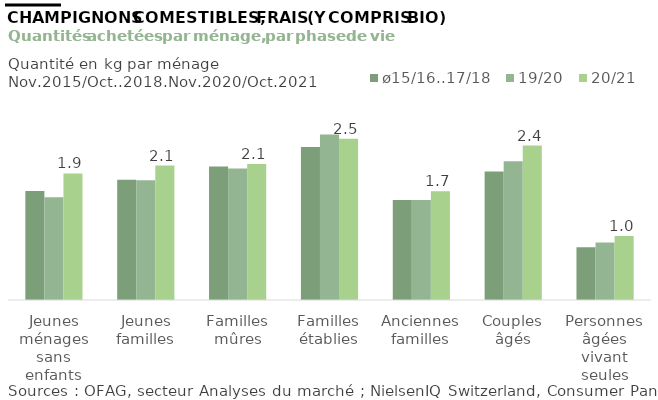
| Category | ø15/16..17/18 | 19/20 | 20/21 |
|---|---|---|---|
| Jeunes ménages sans enfants | 1.67 | 1.574 | 1.937 |
| Jeunes familles | 1.84 | 1.832 | 2.057 |
| Familles mûres | 2.043 | 2.013 | 2.082 |
| Familles établies | 2.341 | 2.532 | 2.467 |
| Anciennes familles | 1.53 | 1.53 | 1.666 |
| Couples âgés | 1.967 | 2.125 | 2.364 |
| Personnes âgées vivant seules | 0.809 | 0.879 | 0.98 |